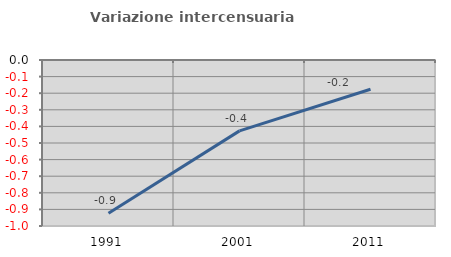
| Category | Variazione intercensuaria annua |
|---|---|
| 1991.0 | -0.923 |
| 2001.0 | -0.427 |
| 2011.0 | -0.176 |